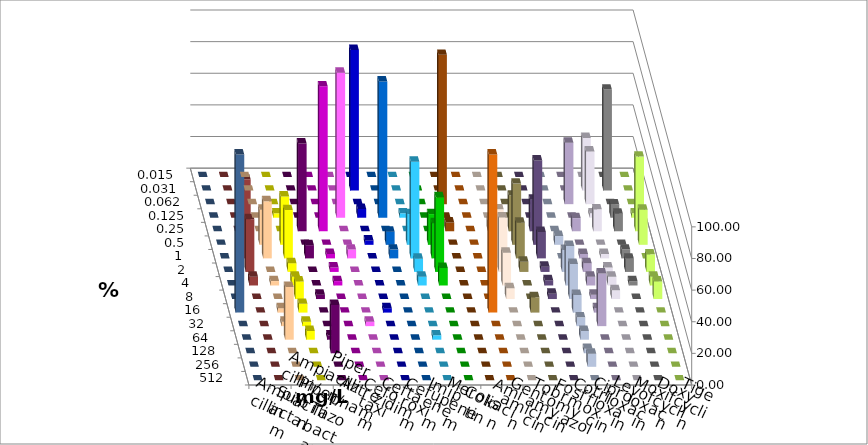
| Category | Ampicillin | Ampicillin/ Sulbactam | Piperacillin | Piperacillin/ Tazobactam | Aztreonam | Cefotaxim | Ceftazidim | Cefuroxim | Imipenem | Meropenem | Colistin | Amikacin | Gentamicin | Tobramycin | Fosfomycin | Cotrimoxazol | Ciprofloxacin | Levofloxacin | Moxifloxacin | Doxycyclin | Tigecyclin |
|---|---|---|---|---|---|---|---|---|---|---|---|---|---|---|---|---|---|---|---|---|---|
| 0.015 | 0 | 0 | 0 | 0 | 0 | 0 | 0 | 0 | 0 | 0 | 0 | 0 | 0 | 0 | 0 | 0 | 0 | 0 | 0 | 0 | 0 |
| 0.031 | 0 | 0 | 0 | 0 | 0 | 88.889 | 0 | 0 | 0 | 0 | 0 | 0 | 0 | 0 | 0 | 0 | 33.333 | 63.889 | 0 | 0 | 0 |
| 0.062 | 0 | 0 | 0 | 0 | 0 | 0 | 0 | 0 | 0 | 94.444 | 0 | 0 | 0 | 0 | 0 | 38.889 | 33.333 | 0 | 0 | 0 | 0 |
| 0.125 | 0 | 2.778 | 0 | 0 | 91.667 | 5.556 | 86.111 | 2.778 | 0 | 0 | 0 | 0 | 0 | 0 | 0 | 0 | 2.778 | 8.333 | 2.778 | 0 | 0 |
| 0.25 | 0 | 0 | 55.556 | 91.667 | 0 | 0 | 0 | 0 | 0 | 5.556 | 0 | 6.897 | 22.581 | 20 | 0 | 8.333 | 13.889 | 11.111 | 47.222 | 0 | 0 |
| 0.5 | 22.222 | 30.556 | 0 | 0 | 0 | 2.778 | 8.333 | 19.444 | 19.444 | 0 | 0 | 0 | 38.71 | 53.333 | 5.556 | 0 | 0 | 0 | 22.222 | 0 | 11.111 |
| 1.0 | 36.111 | 30.556 | 8.333 | 2.778 | 5.556 | 0 | 5.556 | 61.111 | 22.222 | 0 | 0 | 31.034 | 22.581 | 16.667 | 0 | 2.778 | 2.778 | 5.556 | 0 | 0 | 50 |
| 2.0 | 0 | 5.556 | 0 | 2.778 | 0 | 0 | 0 | 8.333 | 47.222 | 0 | 0 | 34.483 | 6.452 | 3.333 | 13.889 | 5.556 | 2.778 | 8.333 | 11.111 | 0 | 33.333 |
| 4.0 | 2.778 | 5.556 | 0 | 2.778 | 0 | 0 | 0 | 5.556 | 11.111 | 0 | 0 | 20.69 | 0 | 3.333 | 25 | 5.556 | 5.556 | 2.778 | 5.556 | 0 | 5.556 |
| 8.0 | 0 | 11.111 | 2.778 | 0 | 0 | 0 | 0 | 0 | 0 | 0 | 0 | 6.897 | 0 | 3.333 | 22.222 | 2.778 | 5.556 | 0 | 11.111 | 0 | 0 |
| 16.0 | 2.778 | 5.556 | 0 | 0 | 0 | 2.778 | 0 | 0 | 0 | 0 | 100 | 0 | 9.677 | 0 | 11.111 | 2.778 | 0 | 0 | 0 | 100 | 0 |
| 32.0 | 2.778 | 2.778 | 0 | 0 | 2.778 | 0 | 0 | 0 | 0 | 0 | 0 | 0 | 0 | 0 | 5.556 | 33.333 | 0 | 0 | 0 | 0 | 0 |
| 64.0 | 33.333 | 5.556 | 2.778 | 0 | 0 | 0 | 0 | 2.778 | 0 | 0 | 0 | 0 | 0 | 0 | 5.556 | 0 | 0 | 0 | 0 | 0 | 0 |
| 128.0 | 0 | 0 | 30.556 | 0 | 0 | 0 | 0 | 0 | 0 | 0 | 0 | 0 | 0 | 0 | 2.778 | 0 | 0 | 0 | 0 | 0 | 0 |
| 256.0 | 0 | 0 | 0 | 0 | 0 | 0 | 0 | 0 | 0 | 0 | 0 | 0 | 0 | 0 | 8.333 | 0 | 0 | 0 | 0 | 0 | 0 |
| 512.0 | 0 | 0 | 0 | 0 | 0 | 0 | 0 | 0 | 0 | 0 | 0 | 0 | 0 | 0 | 0 | 0 | 0 | 0 | 0 | 0 | 0 |